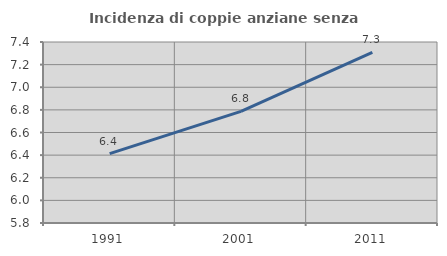
| Category | Incidenza di coppie anziane senza figli  |
|---|---|
| 1991.0 | 6.413 |
| 2001.0 | 6.786 |
| 2011.0 | 7.308 |